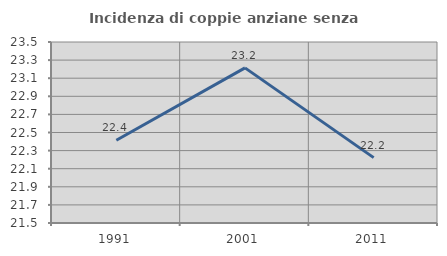
| Category | Incidenza di coppie anziane senza figli  |
|---|---|
| 1991.0 | 22.414 |
| 2001.0 | 23.214 |
| 2011.0 | 22.222 |